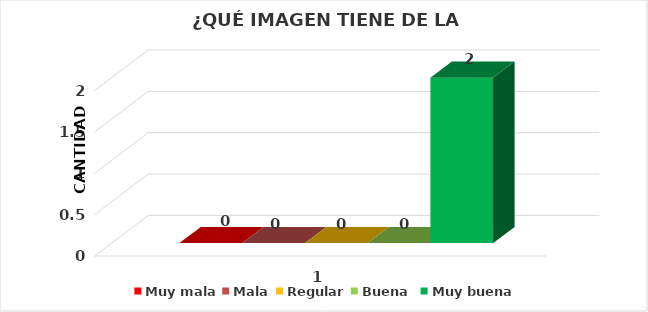
| Category | Muy mala | Mala | Regular | Buena  | Muy buena |
|---|---|---|---|---|---|
| 0 | 0 | 0 | 0 | 0 | 2 |